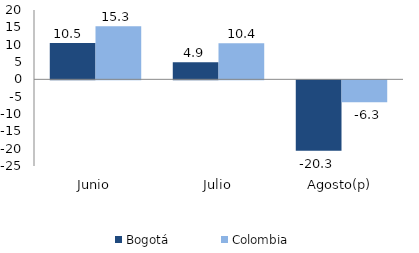
| Category | Bogotá | Colombia |
|---|---|---|
| Junio | 10.455 | 15.332 |
| Julio | 4.925 | 10.414 |
| Agosto(p) | -20.336 | -6.315 |